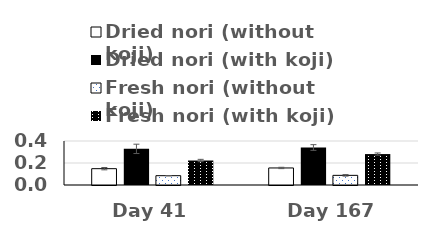
| Category | Dried nori (without koji) | Dried nori (with koji) | Fresh nori (without koji) | Fresh nori (with koji) |
|---|---|---|---|---|
| Day 41 | 0.148 | 0.329 | 0.085 | 0.223 |
| Day 167 | 0.155 | 0.341 | 0.088 | 0.281 |